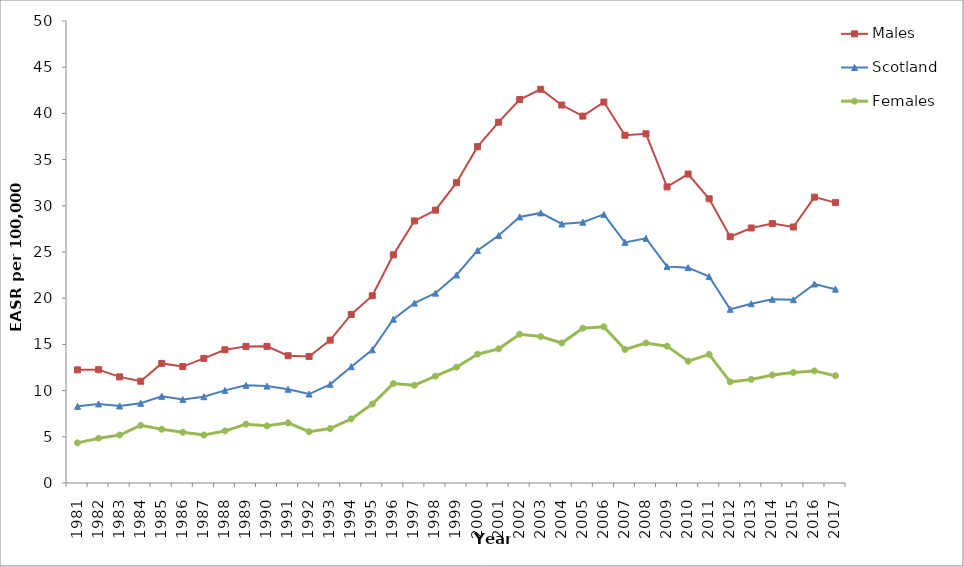
| Category | Males | Scotland | Females |
|---|---|---|---|
| 1981.0 | 12.244 | 8.294 | 4.344 |
| 1982.0 | 12.266 | 8.556 | 4.846 |
| 1983.0 | 11.485 | 8.338 | 5.191 |
| 1984.0 | 11.014 | 8.627 | 6.241 |
| 1985.0 | 12.943 | 9.378 | 5.814 |
| 1986.0 | 12.599 | 9.045 | 5.49 |
| 1987.0 | 13.485 | 9.34 | 5.194 |
| 1988.0 | 14.419 | 10.028 | 5.636 |
| 1989.0 | 14.786 | 10.577 | 6.368 |
| 1990.0 | 14.787 | 10.487 | 6.188 |
| 1991.0 | 13.774 | 10.144 | 6.514 |
| 1992.0 | 13.695 | 9.625 | 5.555 |
| 1993.0 | 15.462 | 10.678 | 5.893 |
| 1994.0 | 18.244 | 12.591 | 6.938 |
| 1995.0 | 20.268 | 14.408 | 8.549 |
| 1996.0 | 24.692 | 17.724 | 10.757 |
| 1997.0 | 28.363 | 19.47 | 10.578 |
| 1998.0 | 29.53 | 20.544 | 11.557 |
| 1999.0 | 32.503 | 22.52 | 12.536 |
| 2000.0 | 36.4 | 25.168 | 13.937 |
| 2001.0 | 39.049 | 26.784 | 14.519 |
| 2002.0 | 41.498 | 28.798 | 16.098 |
| 2003.0 | 42.611 | 29.231 | 15.85 |
| 2004.0 | 40.906 | 28.029 | 15.153 |
| 2005.0 | 39.706 | 28.228 | 16.75 |
| 2006.0 | 41.227 | 29.07 | 16.913 |
| 2007.0 | 37.634 | 26.043 | 14.452 |
| 2008.0 | 37.796 | 26.476 | 15.156 |
| 2009.0 | 32.047 | 23.429 | 14.811 |
| 2010.0 | 33.434 | 23.307 | 13.181 |
| 2011.0 | 30.761 | 22.34 | 13.919 |
| 2012.0 | 26.652 | 18.799 | 10.946 |
| 2013.0 | 27.599 | 19.404 | 11.208 |
| 2014.0 | 28.07 | 19.881 | 11.692 |
| 2015.0 | 27.705 | 19.836 | 11.967 |
| 2016.0 | 30.938 | 21.536 | 12.133 |
| 2017.0 | 30.343 | 20.979 | 11.614 |